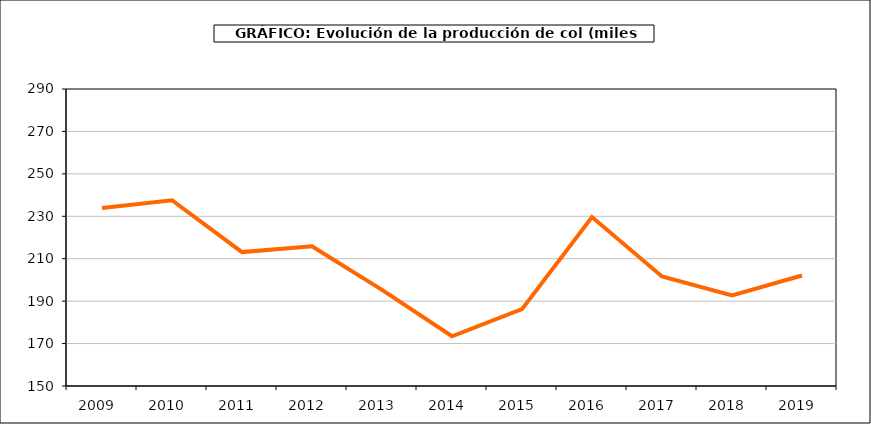
| Category | producción |
|---|---|
| 2009.0 | 233.866 |
| 2010.0 | 237.56 |
| 2011.0 | 213.127 |
| 2012.0 | 215.885 |
| 2013.0 | 195.301 |
| 2014.0 | 173.454 |
| 2015.0 | 186.202 |
| 2016.0 | 229.618 |
| 2017.0 | 201.609 |
| 2018.0 | 192.733 |
| 2019.0 | 202.085 |